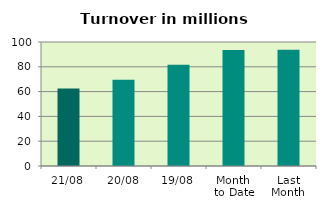
| Category | Series 0 |
|---|---|
| 21/08 | 62.519 |
| 20/08 | 69.589 |
| 19/08 | 81.703 |
| Month 
to Date | 93.47 |
| Last
Month | 93.691 |